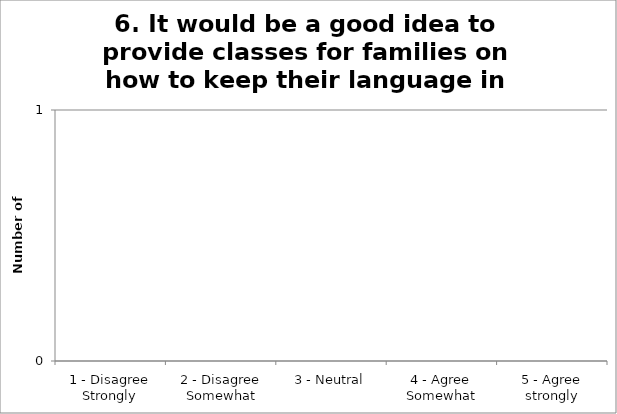
| Category | 6. It would be a good idea to provide classes for families on how to keep their language in use at home |
|---|---|
| 1 - Disagree Strongly | 0 |
| 2 - Disagree Somewhat | 0 |
| 3 - Neutral | 0 |
| 4 - Agree Somewhat | 0 |
| 5 - Agree strongly | 0 |